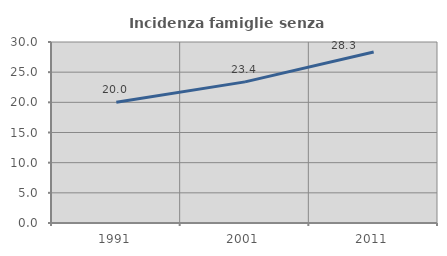
| Category | Incidenza famiglie senza nuclei |
|---|---|
| 1991.0 | 20 |
| 2001.0 | 23.389 |
| 2011.0 | 28.329 |